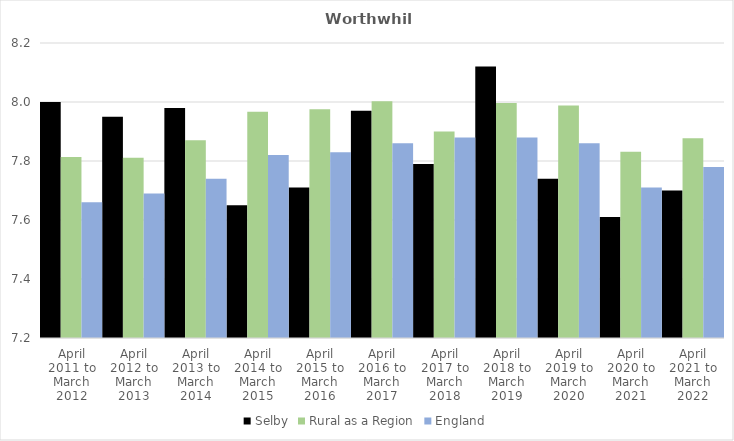
| Category | Selby | Rural as a Region | England |
|---|---|---|---|
| April 2011 to March 2012 | 8 | 7.813 | 7.66 |
| April 2012 to March 2013 | 7.95 | 7.811 | 7.69 |
| April 2013 to March 2014 | 7.98 | 7.871 | 7.74 |
| April 2014 to March 2015 | 7.65 | 7.967 | 7.82 |
| April 2015 to March 2016 | 7.71 | 7.975 | 7.83 |
| April 2016 to March 2017 | 7.97 | 8.002 | 7.86 |
| April 2017 to March 2018 | 7.79 | 7.9 | 7.88 |
| April 2018 to March 2019 | 8.12 | 7.996 | 7.88 |
| April 2019 to March 2020 | 7.74 | 7.988 | 7.86 |
| April 2020 to March 2021 | 7.61 | 7.831 | 7.71 |
| April 2021 to March 2022 | 7.7 | 7.877 | 7.78 |